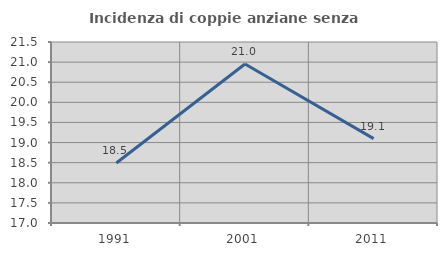
| Category | Incidenza di coppie anziane senza figli  |
|---|---|
| 1991.0 | 18.492 |
| 2001.0 | 20.952 |
| 2011.0 | 19.098 |